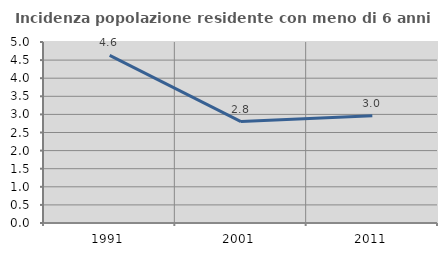
| Category | Incidenza popolazione residente con meno di 6 anni |
|---|---|
| 1991.0 | 4.629 |
| 2001.0 | 2.803 |
| 2011.0 | 2.96 |